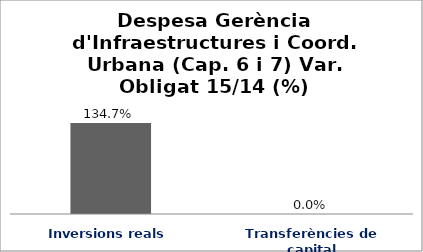
| Category | Series 0 |
|---|---|
| Inversions reals | 1.347 |
| Transferències de capital | 0 |